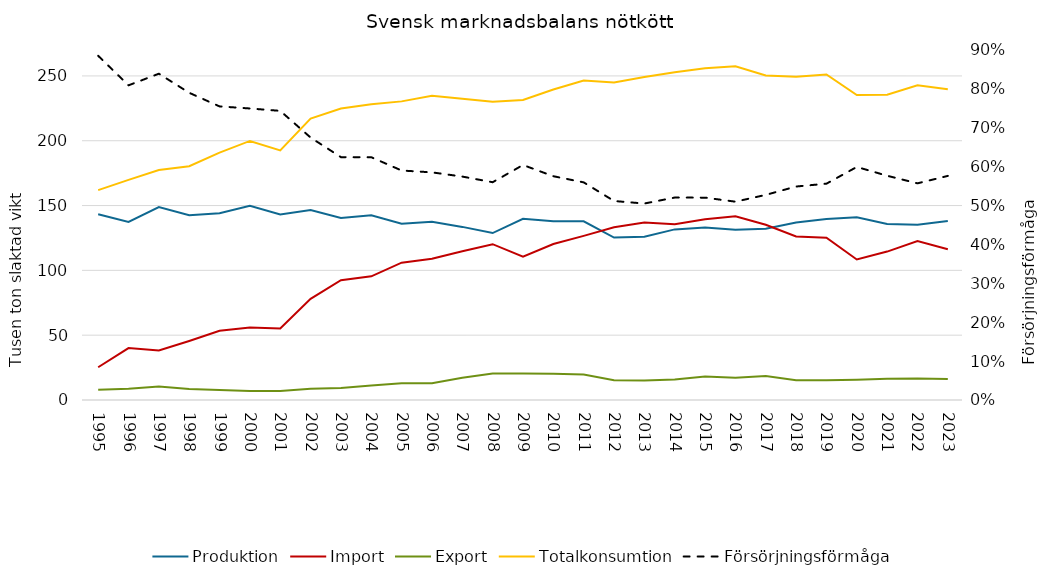
| Category | Produktion | Import | Export | Totalkonsumtion |
|---|---|---|---|---|
| 1995.0 | 143.329 | 25.257 | 7.825 | 161.935 |
| 1996.0 | 137.416 | 40.038 | 8.745 | 169.834 |
| 1997.0 | 148.885 | 38.162 | 10.393 | 177.445 |
| 1998.0 | 142.498 | 45.56 | 8.441 | 180.389 |
| 1999.0 | 144.038 | 53.405 | 7.768 | 190.79 |
| 2000.0 | 149.808 | 55.927 | 7.003 | 199.844 |
| 2001.0 | 143.191 | 55.154 | 6.93 | 192.588 |
| 2002.0 | 146.479 | 78.035 | 8.71 | 217.033 |
| 2003.0 | 140.403 | 92.457 | 9.327 | 224.844 |
| 2004.0 | 142.423 | 95.416 | 11.095 | 228.133 |
| 2005.0 | 135.943 | 105.968 | 12.938 | 230.37 |
| 2006.0 | 137.41 | 108.9 | 12.939 | 234.748 |
| 2007.0 | 133.54 | 114.722 | 17.232 | 232.434 |
| 2008.0 | 128.793 | 120.204 | 20.469 | 229.991 |
| 2009.0 | 139.834 | 110.478 | 20.454 | 231.397 |
| 2010.0 | 137.8 | 120.367 | 20.222 | 239.484 |
| 2011.0 | 137.88 | 126.597 | 19.651 | 246.375 |
| 2012.0 | 125.32 | 133.273 | 15.182 | 244.907 |
| 2013.0 | 125.88 | 136.9 | 15.065 | 249.167 |
| 2014.0 | 131.62 | 135.592 | 15.884 | 252.821 |
| 2015.0 | 133.14 | 139.395 | 18.161 | 255.866 |
| 2016.0 | 131.25 | 141.758 | 17.208 | 257.369 |
| 2017.0 | 132.07 | 135.205 | 18.446 | 250.402 |
| 2018.0 | 136.87 | 126.182 | 15.26 | 249.344 |
| 2019.0 | 139.67 | 125.196 | 15.257 | 251.085 |
| 2020.0 | 141 | 108.402 | 15.642 | 235.276 |
| 2021.0 | 135.82 | 114.502 | 16.354 | 235.52 |
| 2022.0 | 135.24 | 122.662 | 16.673 | 242.744 |
| 2023.0 | 138.17 | 116.254 | 16.139 | 239.756 |